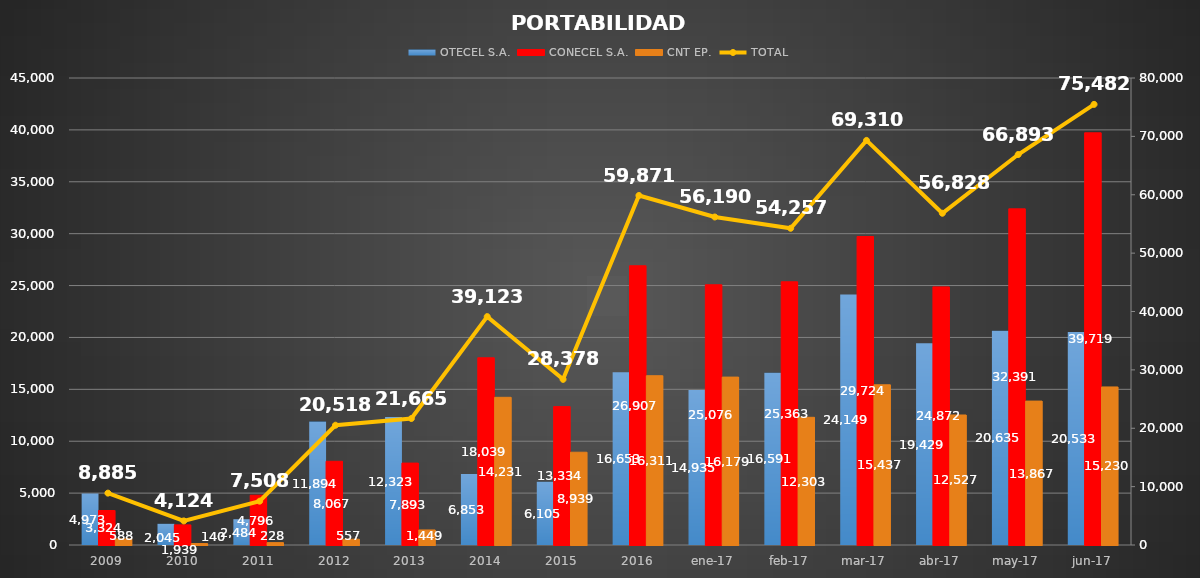
| Category | OTECEL S.A. | CONECEL S.A. | CNT EP. |
|---|---|---|---|
| 2009 | 4973 | 3324 | 588 |
| 2010 | 2045 | 1939 | 140 |
| 2011 | 2484 | 4796 | 228 |
| 2012 | 11894 | 8067 | 557 |
| 2013 | 12323 | 7893 | 1449 |
| 2014 | 6853 | 18039 | 14231 |
| 2015 | 6105 | 13334 | 8939 |
| 2016 | 16653 | 26907 | 16311 |
| ene-17 | 14935 | 25076 | 16179 |
| feb-17 | 16591 | 25363 | 12303 |
| mar-17 | 24149 | 29724 | 15437 |
| abr-17 | 19429 | 24872 | 12527 |
| may-17 | 20635 | 32391 | 13867 |
| jun-17 | 20533 | 39719 | 15230 |